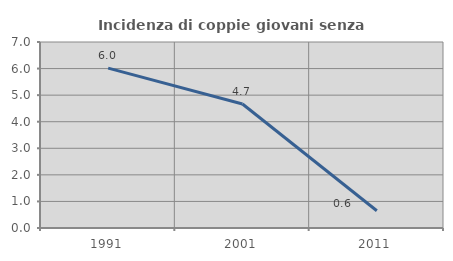
| Category | Incidenza di coppie giovani senza figli |
|---|---|
| 1991.0 | 6.015 |
| 2001.0 | 4.667 |
| 2011.0 | 0.649 |